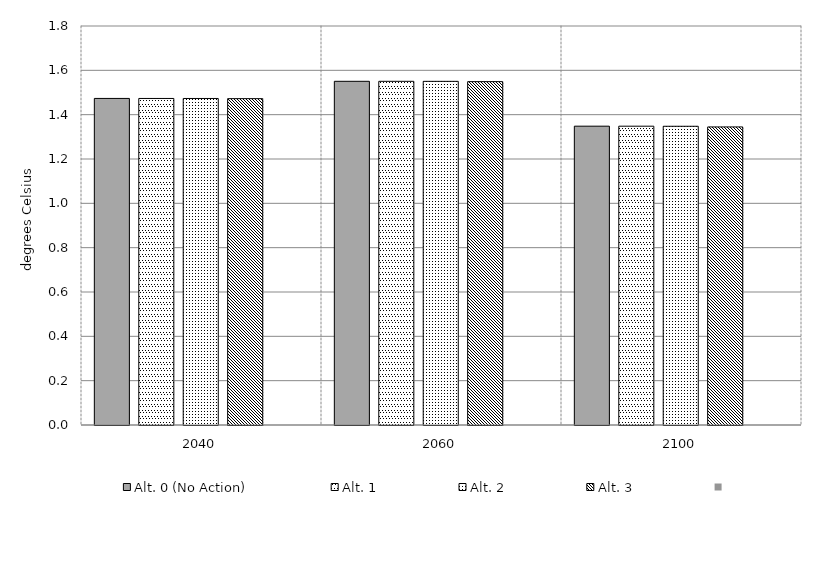
| Category | Alt. 0 (No Action) | Alt. 1 | Alt. 2 | Alt. 3 | Series 4 | Alt 5 | Alt 6 | Alt 7 | Alt 8 | Alt 10 |
|---|---|---|---|---|---|---|---|---|---|---|
| 2040.0 | 1.473 | 1.473 | 1.473 | 1.472 |  |  |  |  |  |  |
| 2060.0 | 1.551 | 1.55 | 1.55 | 1.549 |  |  |  |  |  |  |
| 2100.0 | 1.348 | 1.348 | 1.348 | 1.345 |  |  |  |  |  |  |